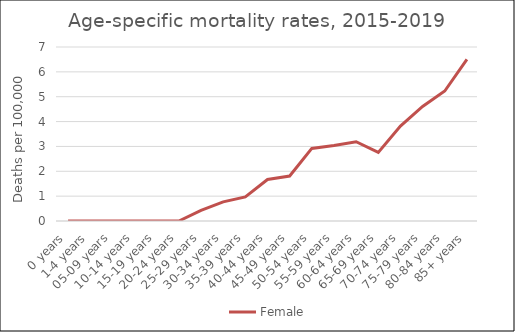
| Category | Female |
|---|---|
| 0 years | 0 |
| 1-4 years | 0 |
| 05-09 years | 0 |
| 10-14 years | 0 |
| 15-19 years | 0 |
| 20-24 years | 0 |
| 25-29 years | 0.43 |
| 30-34 years | 0.77 |
| 35-39 years | 0.97 |
| 40-44 years | 1.67 |
| 45-49 years | 1.81 |
| 50-54 years | 2.92 |
| 55-59 years | 3.04 |
| 60-64 years | 3.19 |
| 65-69 years | 2.76 |
| 70-74 years | 3.82 |
| 75-79 years | 4.61 |
| 80-84 years | 5.23 |
| 85+ years | 6.5 |